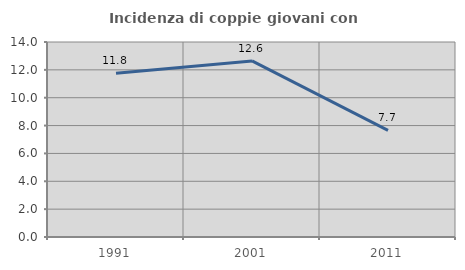
| Category | Incidenza di coppie giovani con figli |
|---|---|
| 1991.0 | 11.765 |
| 2001.0 | 12.644 |
| 2011.0 | 7.65 |